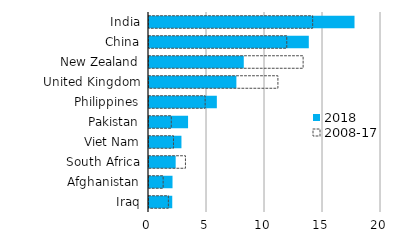
| Category | 2018 | 2008-17 |
|---|---|---|
| India | 17.716 | 14.108 |
| China | 13.776 | 11.877 |
| New Zealand | 8.169 | 13.285 |
| United Kingdom | 7.533 | 11.113 |
| Philippines | 5.849 | 4.839 |
| Pakistan | 3.368 | 1.919 |
| Viet Nam | 2.797 | 2.11 |
| South Africa | 2.298 | 3.142 |
| Afghanistan | 2.027 | 1.218 |
| Iraq | 2.005 | 1.668 |